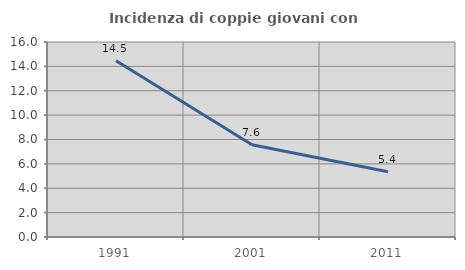
| Category | Incidenza di coppie giovani con figli |
|---|---|
| 1991.0 | 14.458 |
| 2001.0 | 7.576 |
| 2011.0 | 5.357 |